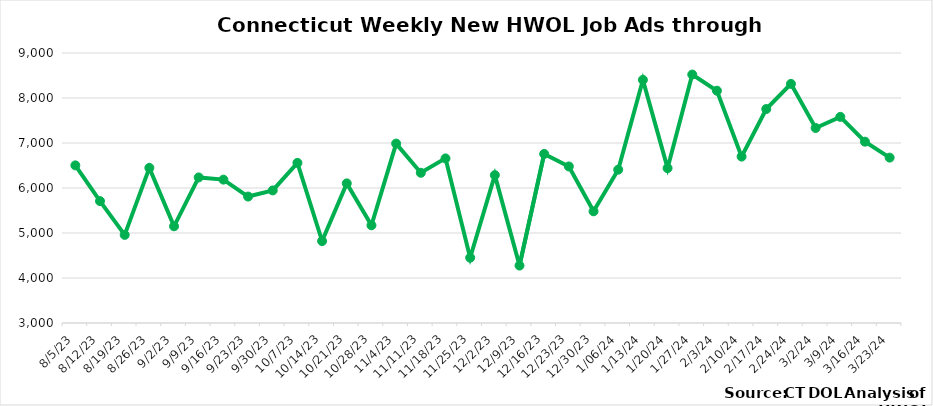
| Category | Connecticut |
|---|---|
| 8/5/23 | 6503 |
| 8/12/23 | 5708 |
| 8/19/23 | 4958 |
| 8/26/23 | 6447 |
| 9/2/23 | 5149 |
| 9/9/23 | 6235 |
| 9/16/23 | 6186 |
| 9/23/23 | 5810 |
| 9/30/23 | 5946 |
| 10/7/23 | 6558 |
| 10/14/23 | 4820 |
| 10/21/23 | 6103 |
| 10/28/23 | 5171 |
| 11/4/23 | 6987 |
| 11/11/23 | 6338 |
| 11/18/23 | 6658 |
| 11/25/23 | 4451 |
| 12/2/23 | 6286 |
| 12/9/23 | 4276 |
| 12/16/23 | 6757 |
|  12/23/23 | 6479 |
|  12/30/23 | 5482 |
|  1/06/24 | 6407 |
|  1/13/24 | 8403 |
|  1/20/24 | 6441 |
|  1/27/24 | 8521 |
|  2/3/24 | 8162 |
|  2/10/24 | 6698 |
|  2/17/24 | 7755 |
|  2/24/24 | 8314 |
|  3/2/24 | 7334 |
|  3/9/24 | 7581 |
|  3/16/24 | 7029 |
|  3/23/24 | 6675 |